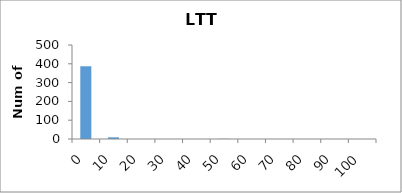
| Category | Series 0 |
|---|---|
| 0.0 | 387 |
| 10.0 | 9 |
| 20.0 | 0 |
| 30.0 | 0 |
| 40.0 | 0 |
| 50.0 | 1 |
| 60.0 | 0 |
| 70.0 | 0 |
| 80.0 | 0 |
| 90.0 | 0 |
| 100.0 | 0 |